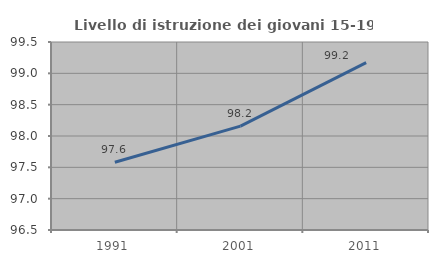
| Category | Livello di istruzione dei giovani 15-19 anni |
|---|---|
| 1991.0 | 97.582 |
| 2001.0 | 98.157 |
| 2011.0 | 99.172 |